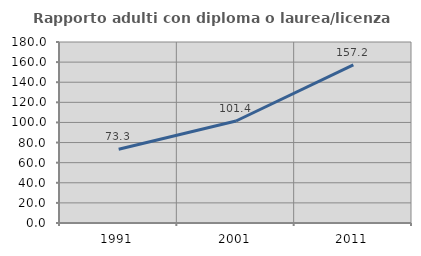
| Category | Rapporto adulti con diploma o laurea/licenza media  |
|---|---|
| 1991.0 | 73.292 |
| 2001.0 | 101.435 |
| 2011.0 | 157.214 |